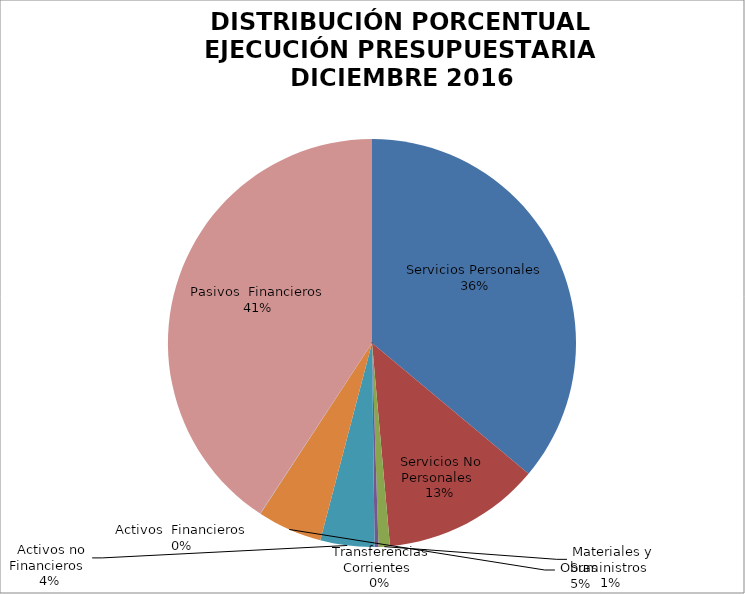
| Category | Series 0 | Series 1 |
|---|---|---|
| Servicios Personales | 20111600.6 | 0.361 |
| Servicios No Personales | 6976083 | 0.125 |
| Materiales y Suministros | 501869.29 | 0.009 |
| Transferencias Corrientes | 169538.5 | 0.004 |
| Activos no Financieros | 2388546.3 | 0.043 |
| Obras | 2860161.7 | 0.073 |
| Activos  Financieros | 12400 | 0 |
| Pasivos  Financieros | 22723245.19 | 0.408 |